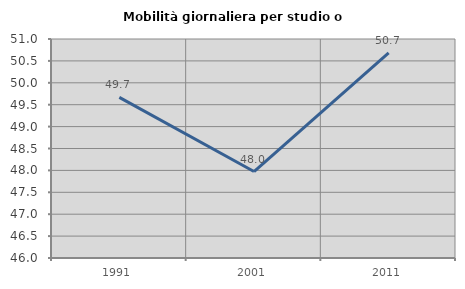
| Category | Mobilità giornaliera per studio o lavoro |
|---|---|
| 1991.0 | 49.666 |
| 2001.0 | 47.975 |
| 2011.0 | 50.681 |